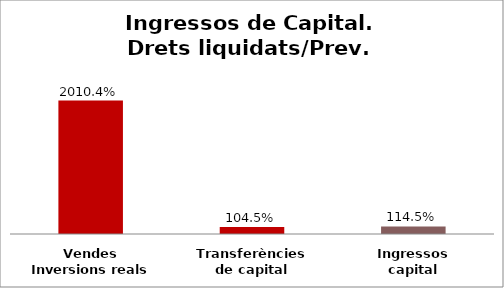
| Category | Series 0 |
|---|---|
| Vendes Inversions reals | 20.104 |
| Transferències de capital | 1.045 |
| Ingressos capital | 1.145 |